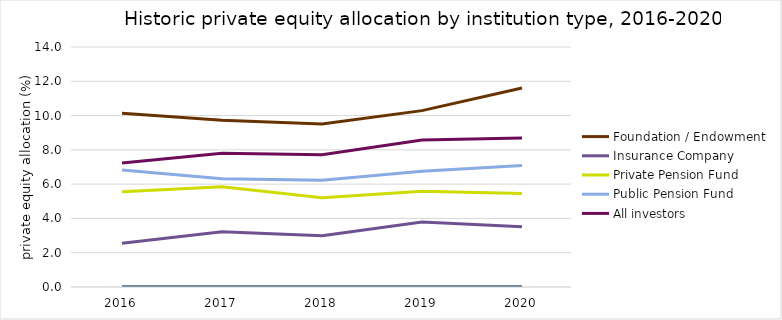
| Category | Foundation / Endowment | Insurance Company | Private Pension Fund | Public Pension Fund | Series 7 | Series 10 | All investors  |
|---|---|---|---|---|---|---|---|
| 2016.0 | 10.136 | 2.55 | 5.551 | 6.829 |  |  | 7.229 |
| 2017.0 | 9.729 | 3.221 | 5.841 | 6.309 |  |  | 7.805 |
| 2018.0 | 9.51 | 2.985 | 5.203 | 6.225 |  |  | 7.71 |
| 2019.0 | 10.289 | 3.794 | 5.591 | 6.747 |  |  | 8.576 |
| 2020.0 | 11.609 | 3.516 | 5.456 | 7.092 |  |  | 8.696 |